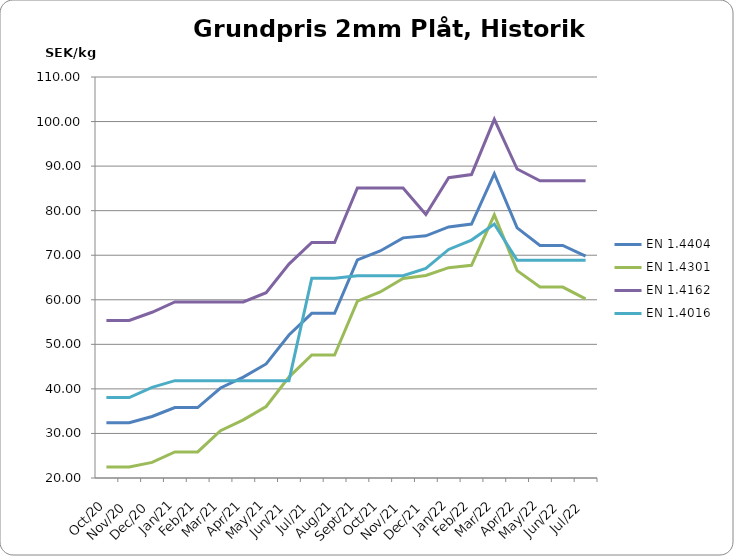
| Category | EN 1.4404 | EN 1.4301 | EN 1.4162  | EN 1.4016 |
|---|---|---|---|---|
| 2020-10-26 | 32.4 | 22.45 | 55.35 | 38.05 |
| 2020-11-26 | 32.4 | 22.45 | 55.35 | 38.05 |
| 2020-12-26 | 33.8 | 23.5 | 57.2 | 40.35 |
| 2021-01-26 | 35.8 | 25.85 | 59.5 | 41.85 |
| 2021-02-26 | 35.8 | 25.85 | 59.5 | 41.85 |
| 2021-03-26 | 40.2 | 30.6 | 59.5 | 41.85 |
| 2021-04-26 | 42.65 | 33.05 | 59.5 | 41.85 |
| 2021-05-26 | 45.6 | 36.05 | 61.6 | 41.85 |
| 2021-06-26 | 52.1 | 42.65 | 68 | 41.85 |
| 2021-07-26 | 56.95 | 47.6 | 72.85 | 64.85 |
| 2021-08-26 | 56.95 | 47.6 | 72.85 | 64.85 |
| 2021-09-26 | 68.95 | 59.7 | 85.1 | 65.4 |
| 2021-10-26 | 70.95 | 61.75 | 85.1 | 65.4 |
| 2021-11-26 | 73.9 | 64.8 | 85.1 | 65.4 |
| 2021-12-26 | 74.35 | 65.45 | 79.15 | 67.05 |
| 2022-01-26 | 76.35 | 67.2 | 87.4 | 71.3 |
| 2022-02-26 | 77 | 67.75 | 88.1 | 73.4 |
| 2022-03-26 | 88.3 | 79.05 | 100.5 | 77 |
| 2022-04-26 | 76.15 | 66.55 | 89.35 | 68.85 |
| 2022-05-26 | 72.2 | 62.85 | 86.7 | 68.85 |
| 2022-06-26 | 72.2 | 62.85 | 86.7 | 68.85 |
| 2022-07-26 | 69.8 | 60.2 | 86.7 | 68.85 |